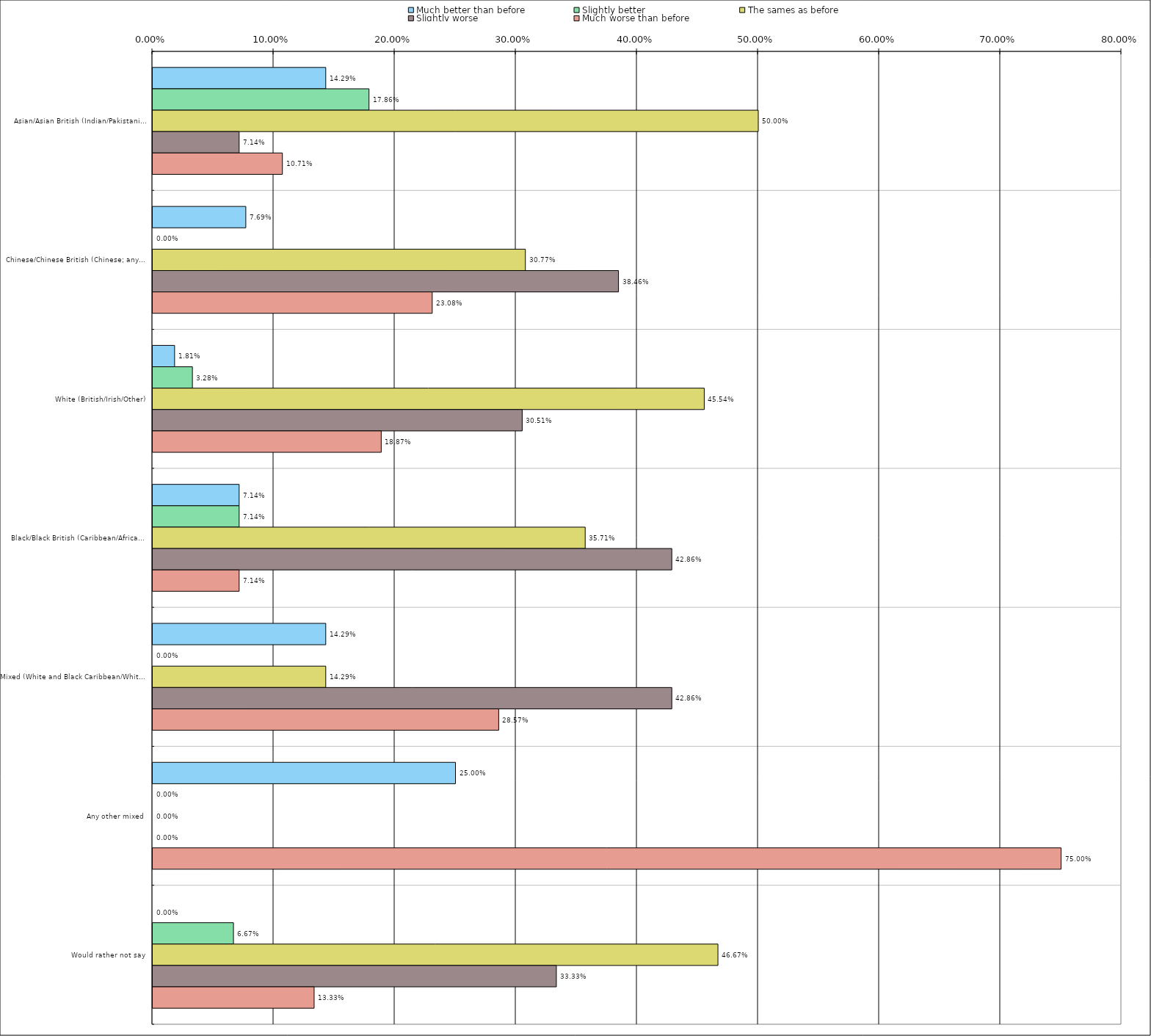
| Category | Much better than before | Slightly better | The sames as before | Slightly worse | Much worse than before |
|---|---|---|---|---|---|
| 0 | 0.143 | 0.179 | 0.5 | 0.071 | 0.107 |
| 1 | 0.077 | 0 | 0.308 | 0.385 | 0.231 |
| 2 | 0.018 | 0.033 | 0.455 | 0.305 | 0.189 |
| 3 | 0.071 | 0.071 | 0.357 | 0.429 | 0.071 |
| 4 | 0.143 | 0 | 0.143 | 0.429 | 0.286 |
| 5 | 0.25 | 0 | 0 | 0 | 0.75 |
| 6 | 0 | 0.067 | 0.467 | 0.333 | 0.133 |